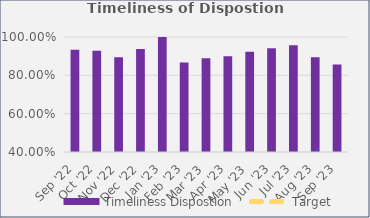
| Category | Timeliness Dispostion |
|---|---|
| Sep '22 | 0.933 |
| Oct '22 | 0.929 |
| Nov '22 | 0.895 |
| Dec '22 | 0.938 |
| Jan '23 | 1 |
| Feb '23 | 0.867 |
| Mar '23 | 0.889 |
| Apr '23 | 0.9 |
| May '23 | 0.923 |
| Jun '23 | 0.941 |
| Jul '23 | 0.957 |
| Aug '23 | 0.895 |
| Sep '23 | 0.857 |